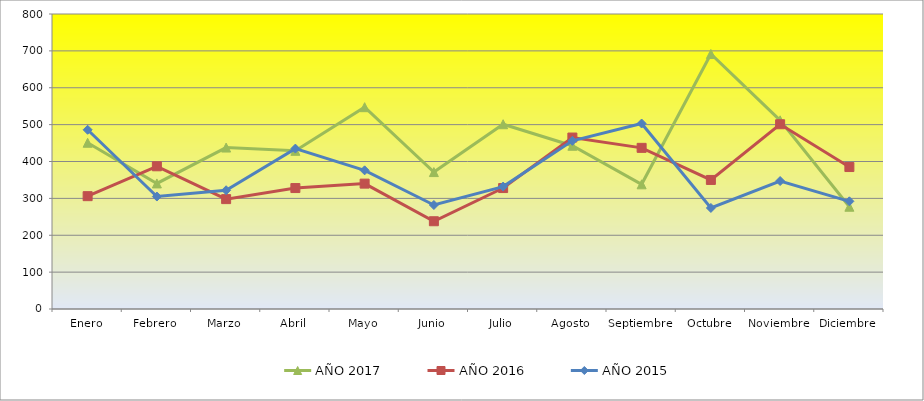
| Category | AÑO 2017 | AÑO 2016 | AÑO 2015 |
|---|---|---|---|
| Enero | 450.811 | 306 | 486 |
| Febrero | 340.541 | 387 | 305 |
| Marzo | 437.838 | 298 | 322 |
| Abril | 428.919 | 328 | 435 |
| Mayo | 547.297 | 340 | 376 |
| Junio | 371.351 | 238 | 282 |
| Julio | 501.081 | 328 | 332 |
| Agosto | 442.703 | 465 | 456 |
| Septiembre | 338.108 | 437 | 503 |
| Octubre | 691.579 | 350 | 274 |
| Noviembre | 511.579 | 501 | 347 |
| Diciembre | 277.297 | 385 | 292 |